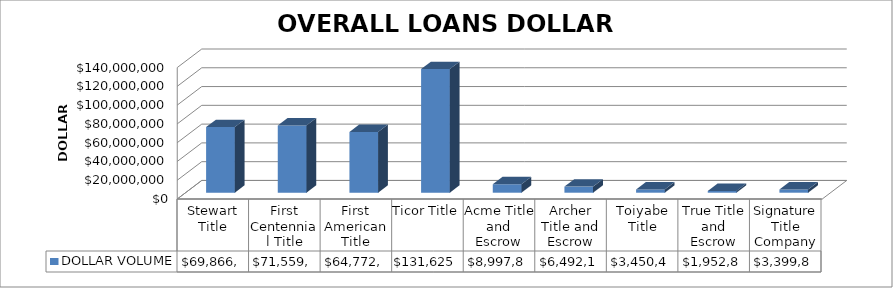
| Category | DOLLAR VOLUME |
|---|---|
| Stewart Title | 69866511.69 |
| First Centennial Title | 71559332 |
| First American Title | 64772967 |
| Ticor Title | 131625776.08 |
| Acme Title and Escrow | 8997893 |
| Archer Title and Escrow | 6492190 |
| Toiyabe Title | 3450467 |
| True Title and Escrow | 1952800 |
| Signature Title Company | 3399801 |